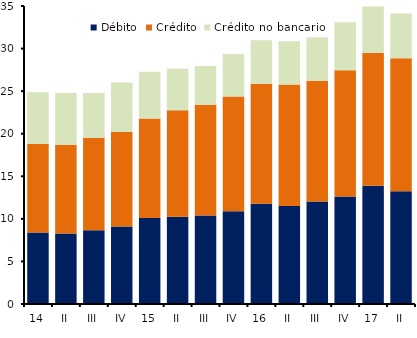
| Category | Débito | Crédito | Crédito no bancario |
|---|---|---|---|
| 14 | 8.401 | 10.402 | 6.062 |
| II | 8.294 | 10.396 | 6.085 |
| III | 8.67 | 10.855 | 5.258 |
| IV | 9.112 | 11.095 | 5.797 |
| 15 | 10.087 | 11.703 | 5.501 |
| II | 10.233 | 12.536 | 4.86 |
| III | 10.408 | 12.998 | 4.55 |
| IV | 10.885 | 13.497 | 4.968 |
| 16 | 11.785 | 14.083 | 5.1 |
| II | 11.508 | 14.259 | 5.091 |
| III | 12.045 | 14.177 | 5.101 |
| IV | 12.616 | 14.837 | 5.633 |
| 17 | 13.903 | 15.618 | 5.409 |
| II | 13.248 | 15.617 | 5.268 |